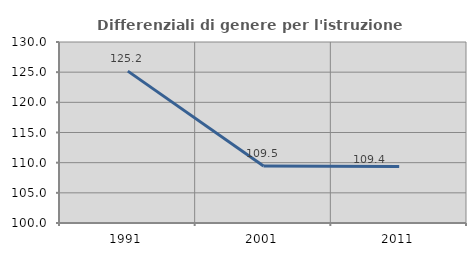
| Category | Differenziali di genere per l'istruzione superiore |
|---|---|
| 1991.0 | 125.174 |
| 2001.0 | 109.453 |
| 2011.0 | 109.378 |